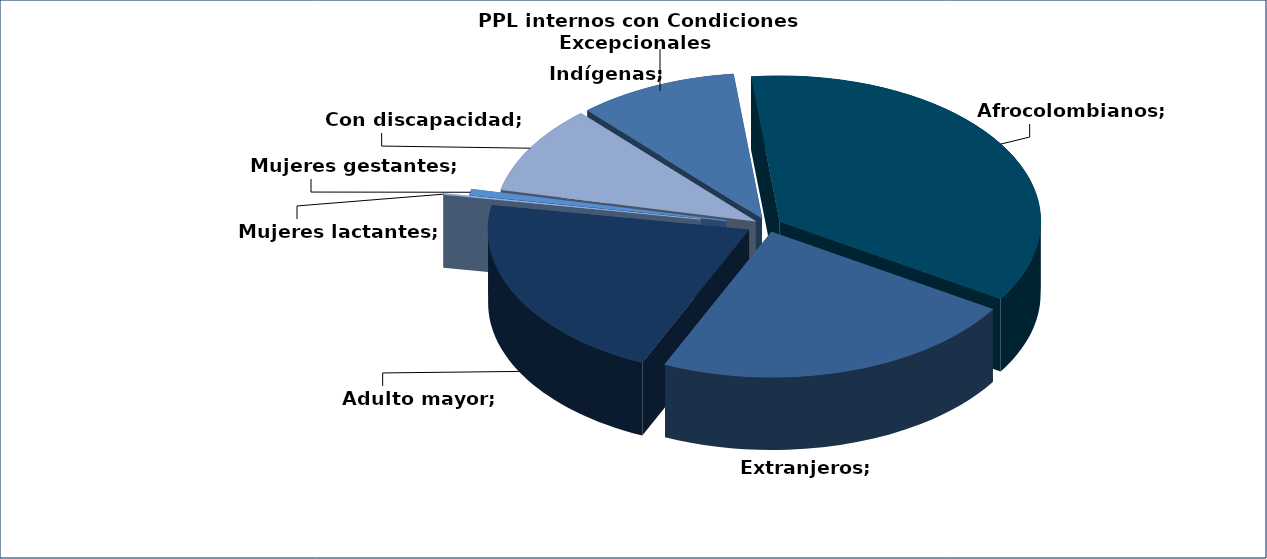
| Category | Series 0 |
|---|---|
| Indígenas | 865 |
| Afrocolombianos | 3111 |
| Extranjeros | 1987 |
| Adulto mayor | 1829 |
| Mujeres lactantes | 12 |
| Mujeres gestantes | 58 |
| Con discapacidad | 859 |